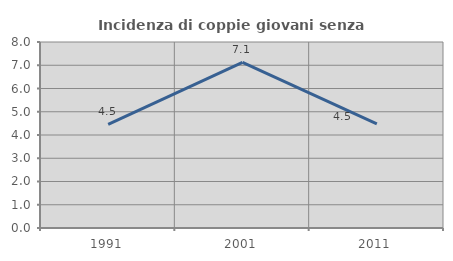
| Category | Incidenza di coppie giovani senza figli |
|---|---|
| 1991.0 | 4.454 |
| 2001.0 | 7.121 |
| 2011.0 | 4.483 |